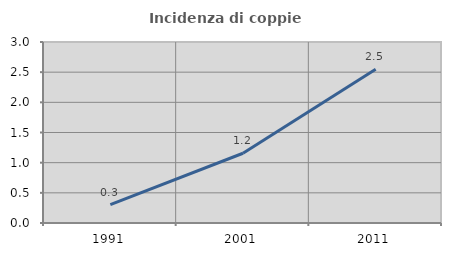
| Category | Incidenza di coppie miste |
|---|---|
| 1991.0 | 0.303 |
| 2001.0 | 1.156 |
| 2011.0 | 2.55 |